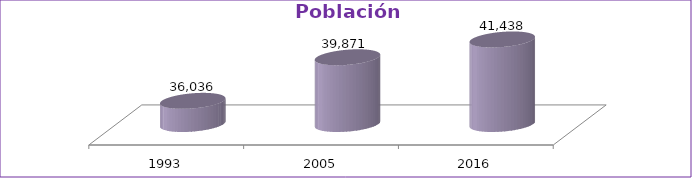
| Category | Población Total |
|---|---|
| 1993 | 36036 |
| 2005 | 39871 |
| 2016 | 41438 |